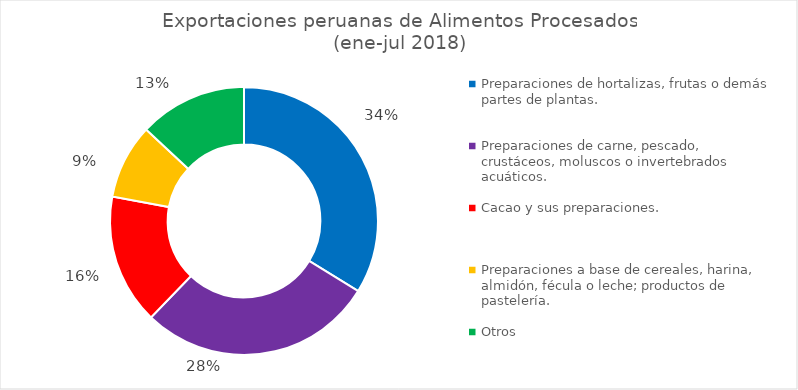
| Category | Series 0 |
|---|---|
| Preparaciones de hortalizas, frutas o demás partes de plantas. | 0.338 |
| Preparaciones de carne, pescado, crustáceos, moluscos o invertebrados acuáticos. | 0.285 |
| Cacao y sus preparaciones. | 0.157 |
| Preparaciones a base de cereales, harina, almidón, fécula o leche; productos de pastelería. | 0.09 |
| Otros | 0.13 |